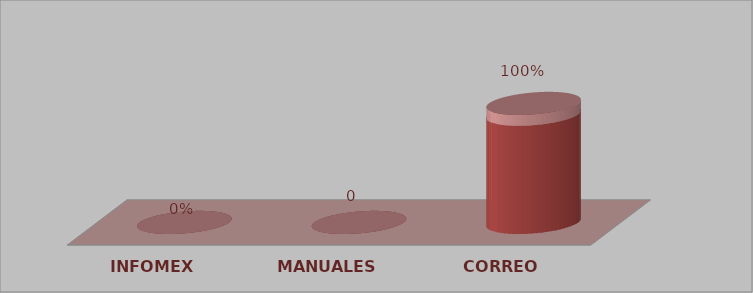
| Category | Series 0 | Series 1 |
|---|---|---|
| INFOMEX | 0 | 0 |
| MANUALES | 0 | 0 |
| CORREO | 10 | 1 |